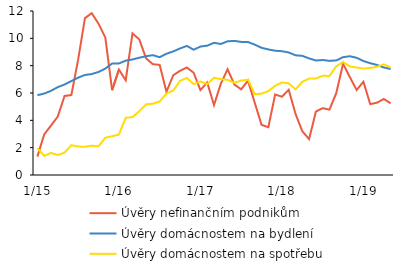
| Category | Úvěry nefinančním podnikům | Úvěry domácnostem na bydlení | Úvěry domácnostem na spotřebu |
|---|---|---|---|
|  1/15 | 1.344 | 5.84 | 1.96 |
| 2 | 2.969 | 5.96 | 1.4 |
| 3 | 3.615 | 6.159 | 1.62 |
| 4 | 4.281 | 6.43 | 1.462 |
| 5 | 5.782 | 6.62 | 1.639 |
| 6 | 5.853 | 6.869 | 2.183 |
| 7 | 8.437 | 7.124 | 2.08 |
| 8 | 11.475 | 7.318 | 2.069 |
| 9 | 11.846 | 7.384 | 2.145 |
| 10 | 11.075 | 7.54 | 2.098 |
| 11 | 10.058 | 7.79 | 2.724 |
| 12 | 6.204 | 8.153 | 2.838 |
|  1/16 | 7.719 | 8.163 | 2.96 |
| 2 | 6.928 | 8.368 | 4.184 |
| 3 | 10.362 | 8.454 | 4.237 |
| 4 | 9.918 | 8.583 | 4.663 |
| 5 | 8.537 | 8.692 | 5.171 |
| 6 | 8.109 | 8.768 | 5.214 |
| 7 | 8.057 | 8.617 | 5.377 |
| 8 | 6.09 | 8.871 | 5.965 |
| 9 | 7.299 | 9.044 | 6.179 |
| 10 | 7.625 | 9.26 | 6.887 |
| 11 | 7.866 | 9.446 | 7.103 |
| 12 | 7.485 | 9.166 | 6.655 |
|  1/17 | 6.213 | 9.397 | 6.847 |
| 2 | 6.765 | 9.463 | 6.648 |
| 3 | 5.115 | 9.671 | 7.111 |
| 4 | 6.673 | 9.588 | 7.018 |
| 5 | 7.74 | 9.782 | 6.965 |
| 6 | 6.618 | 9.815 | 6.745 |
| 7 | 6.269 | 9.74 | 6.909 |
| 8 | 6.902 | 9.729 | 6.978 |
| 9 | 5.281 | 9.537 | 5.921 |
| 10 | 3.669 | 9.308 | 5.949 |
| 11 | 3.496 | 9.188 | 6.133 |
| 12 | 5.891 | 9.094 | 6.528 |
|  1/18 | 5.728 | 9.059 | 6.772 |
| 2 | 6.234 | 8.964 | 6.704 |
| 3 | 4.475 | 8.76 | 6.263 |
| 4 | 3.204 | 8.718 | 6.82 |
| 5 | 2.625 | 8.532 | 7.051 |
| 6 | 4.638 | 8.379 | 7.065 |
| 7 | 4.89 | 8.413 | 7.26 |
| 8 | 4.785 | 8.355 | 7.247 |
| 9 | 5.993 | 8.384 | 7.95 |
| 10 | 8.137 | 8.622 | 8.271 |
| 11 | 7.165 | 8.691 | 7.942 |
| 12 | 6.217 | 8.577 | 7.867 |
|  1/19 | 6.825 | 8.34 | 7.783 |
| 2 | 5.184 | 8.179 | 7.832 |
| 3 | 5.293 | 8.052 | 7.921 |
| 4 | 5.561 | 7.865 | 8.096 |
| 5 | 5.245 | 7.758 | 7.872 |